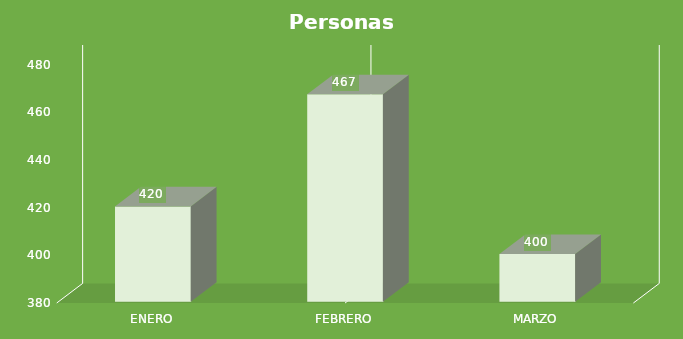
| Category | Personas Atendidas  |
|---|---|
| ENERO | 420 |
| FEBRERO | 467 |
| MARZO | 400 |